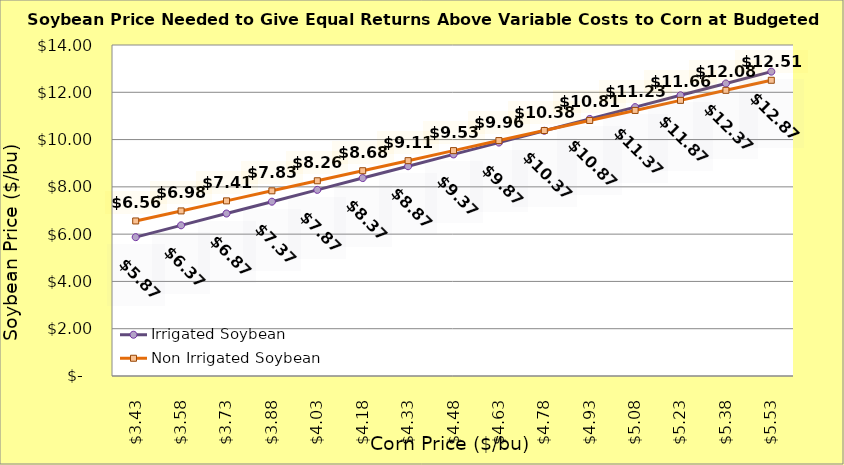
| Category | Irrigated Soybean | Non Irrigated Soybean |
|---|---|---|
| 3.4299999999999997 | 5.873 | 6.558 |
| 3.5799999999999996 | 6.373 | 6.983 |
| 3.7299999999999995 | 6.873 | 7.408 |
| 3.8799999999999994 | 7.373 | 7.833 |
| 4.029999999999999 | 7.873 | 8.258 |
| 4.18 | 8.373 | 8.683 |
| 4.33 | 8.873 | 9.108 |
| 4.48 | 9.373 | 9.533 |
| 4.630000000000001 | 9.873 | 9.958 |
| 4.780000000000001 | 10.373 | 10.383 |
| 4.9300000000000015 | 10.873 | 10.808 |
| 5.080000000000002 | 11.373 | 11.233 |
| 5.230000000000002 | 11.873 | 11.658 |
| 5.380000000000003 | 12.373 | 12.083 |
| 5.530000000000003 | 12.873 | 12.508 |